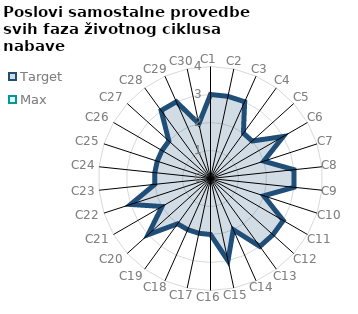
| Category | Target | Max |
|---|---|---|
| C1 | 3 | 0 |
| C2 | 3 | 0 |
| C3 | 3 | 0 |
| C4 | 2 | 0 |
| C5 | 2 | 0 |
| C6 | 3 | 0 |
| C7 | 2 | 0 |
| C8 | 3 | 0 |
| C9 | 3 | 0 |
| C10 | 2 | 0 |
| C11 | 3 | 0 |
| C12 | 3 | 0 |
| C13 | 3 | 0 |
| C14 | 2 | 0 |
| C15 | 3 | 0 |
| C16 | 2 | 0 |
| C17 | 2 | 0 |
| C18 | 2 | 0 |
| C19 | 2 | 0 |
| C20 | 3 | 0 |
| C21 | 2 | 0 |
| C22 | 3 | 0 |
| C23 | 2 | 0 |
| C24 | 2 | 0 |
| C25 | 2 | 0 |
| C26 | 2 | 0 |
| C27 | 2 | 0 |
| C28 | 3 | 0 |
| C29 | 3 | 0 |
| C30 | 2 | 0 |